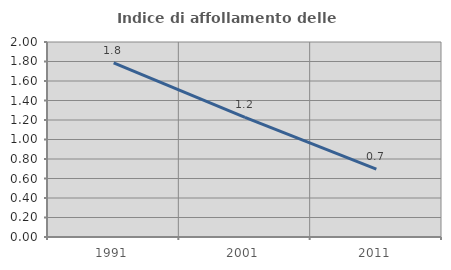
| Category | Indice di affollamento delle abitazioni  |
|---|---|
| 1991.0 | 1.785 |
| 2001.0 | 1.227 |
| 2011.0 | 0.695 |